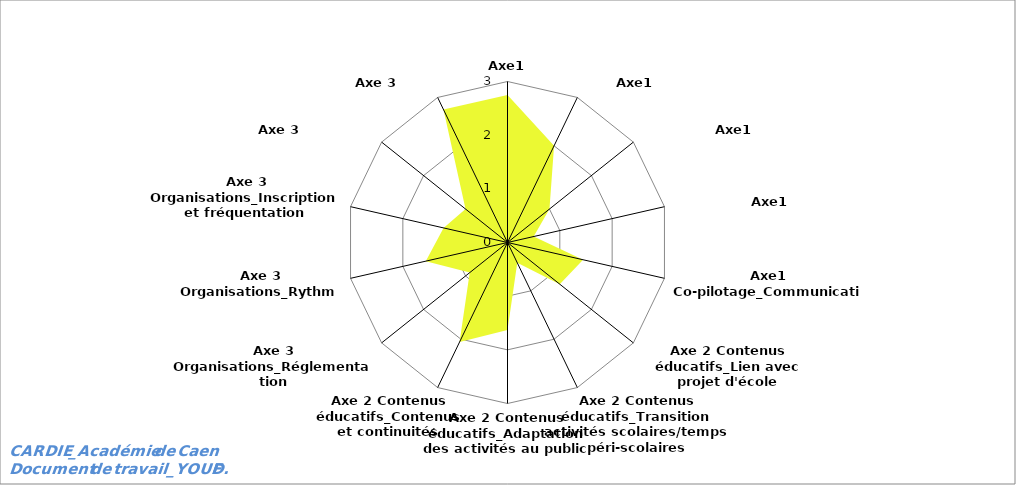
| Category | Series 0 |
|---|---|
| Axe1 Co-pilotage_Contexte | 2.75 |
| Axe1 Co-pilotage_Instances | 2 |
| Axe1 Co-pilotage_Modalités | 1 |
| Axe1 Co-pilotage_Evaluation | 0.5 |
| Axe1 Co-pilotage_Communication | 1.444 |
| Axe 2 Contenus éducatifs_Lien avec projet d'école | 1.245 |
| Axe 2 Contenus éducatifs_Transition activités scolaires/temps péri-scolaires | 0.419 |
| Axe 2 Contenus éducatifs_Adaptation des activités au public | 1.632 |
| Axe 2 Contenus éducatifs_Contenus et continuités | 2.058 |
| Axe 3 Organisations_Réglementation | 0.9 |
| Axe 3 Organisations_Rythmes | 1.562 |
| Axe 3 Organisations_Inscription et fréquentation | 1.222 |
| Axe 3 Organisations_Locaux | 1 |
| Axe 3 Organisations_Matériel | 2.75 |